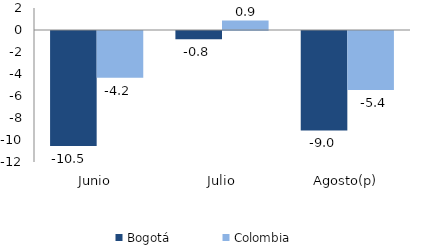
| Category | Bogotá | Colombia |
|---|---|---|
| Junio | -10.451 | -4.248 |
| Julio | -0.75 | 0.858 |
| Agosto(p) | -9.039 | -5.361 |